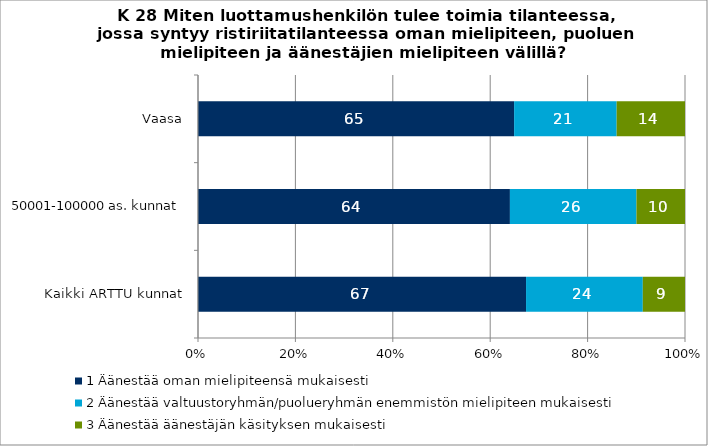
| Category | 1 Äänestää oman mielipiteensä mukaisesti  | 2 Äänestää valtuustoryhmän/puolueryhmän enemmistön mielipiteen mukaisesti  | 3 Äänestää äänestäjän käsityksen mukaisesti  |
|---|---|---|---|
| Kaikki ARTTU kunnat | 67.362 | 23.974 | 8.664 |
| 50001-100000 as. kunnat | 64.048 | 25.982 | 9.97 |
| Vaasa | 64.912 | 21.053 | 14.035 |